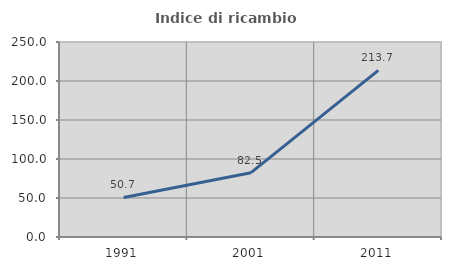
| Category | Indice di ricambio occupazionale  |
|---|---|
| 1991.0 | 50.743 |
| 2001.0 | 82.484 |
| 2011.0 | 213.694 |